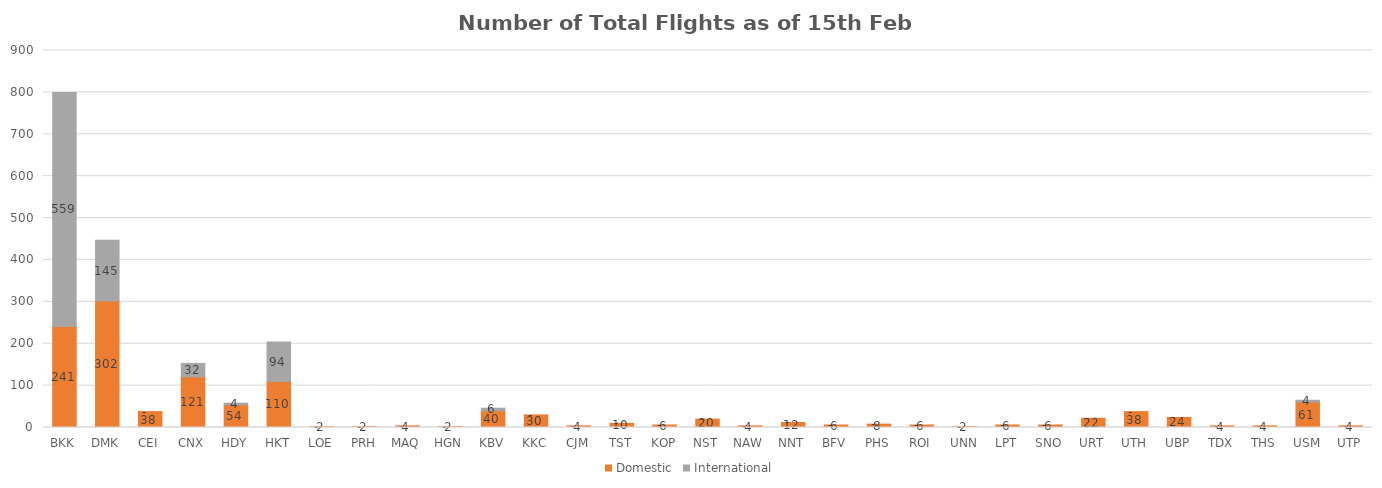
| Category | Domestic | International |
|---|---|---|
| BKK | 241 | 559 |
| DMK | 302 | 145 |
| CEI | 38 | 0 |
| CNX | 121 | 32 |
| HDY | 54 | 4 |
| HKT | 110 | 94 |
| LOE | 2 | 0 |
| PRH | 2 | 0 |
| MAQ | 4 | 0 |
| HGN | 2 | 0 |
| KBV | 40 | 6 |
| KKC | 30 | 0 |
| CJM | 4 | 0 |
| TST | 10 | 0 |
| KOP | 6 | 0 |
| NST | 20 | 0 |
| NAW | 4 | 0 |
| NNT | 12 | 0 |
| BFV | 6 | 0 |
| PHS | 8 | 0 |
| ROI | 6 | 0 |
| UNN | 2 | 0 |
| LPT | 6 | 0 |
| SNO | 6 | 0 |
| URT | 22 | 0 |
| UTH | 38 | 0 |
| UBP | 24 | 0 |
| TDX | 4 | 0 |
| THS | 4 | 0 |
| USM | 61 | 4 |
| UTP | 4 | 0 |